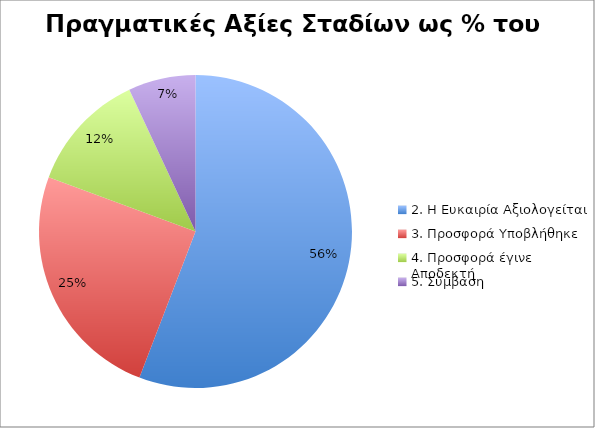
| Category | Αξία Σταδίου ως % του Καναλιού |
|---|---|
| 2. Η Ευκαιρία Αξιολογείται | 0.166 |
| 3. Προσφορά Υποβλήθηκε | 0.074 |
| 4. Προσφορά έγινε Αποδεκτή | 0.037 |
| 5. Σύμβαση | 0.021 |